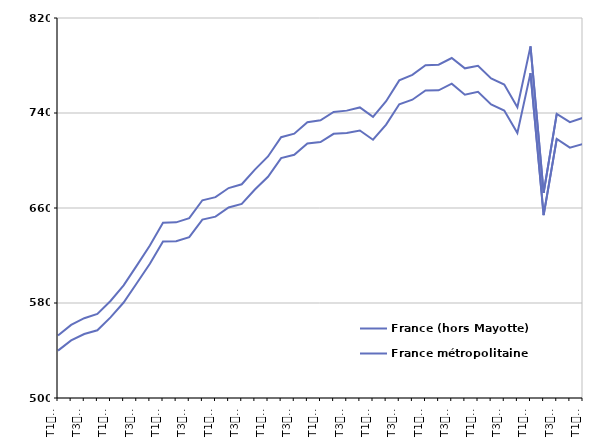
| Category | France (hors Mayotte) | France métropolitaine |
|---|---|---|
| T1
2011 | 552.7 | 539.9 |
| T2
2011 | 561.6 | 548.5 |
| T3
2011 | 567.2 | 553.9 |
| T4
2011 | 570.8 | 557 |
| T1
2012 | 581.7 | 567.9 |
| T2
2012 | 594.8 | 580.4 |
| T3
2012 | 611.5 | 596.6 |
| T4
2012 | 628.4 | 613 |
| T1
2013 | 647.5 | 631.8 |
| T2
2013 | 647.9 | 632.1 |
| T3
2013 | 651.4 | 635.5 |
| T4
2013 | 666.5 | 650.2 |
| T1
2014 | 669.1 | 652.7 |
| T2
2014 | 676.8 | 660.4 |
| T3
2014 | 680 | 663.5 |
| T4
2014 | 692.3 | 675.6 |
| T1
2015 | 703.4 | 686.3 |
| T2
2015 | 719.6 | 702 |
| T3
2015 | 722.6 | 704.8 |
| T4
2015 | 732.3 | 714.4 |
| T1
2016 | 733.8 | 715.5 |
| T2
2016 | 740.9 | 722.5 |
| T3
2016 | 742 | 723.2 |
| T4
2016 | 744.7 | 725.3 |
| T1
2017 | 736.8 | 717.5 |
| T2
2017 | 749.9 | 730.2 |
| T3
2017 | 767.5 | 747.3 |
| T4
2017 | 772.1 | 751.2 |
| T1
2018 | 780.2 | 759 |
| T2
2018 | 780.7 | 759.1 |
| T3
2018 | 786.3 | 764.7 |
| T4
2018 | 777.6 | 755.4 |
| T1
2019 | 779.8 | 757.8 |
| T2
2019 | 769.1 | 747.2 |
| T3
2019 | 764 | 742.1 |
| T4
2019 | 744.9 | 723.2 |
| T1
2020 | 796.1 | 773.6 |
| T2
2020 | 672.7 | 654 |
| T3
2020 | 739.2 | 718.2 |
| T4
2020 | 732.3 | 710.8 |
| T1
2021 | 736 | 713.9 |